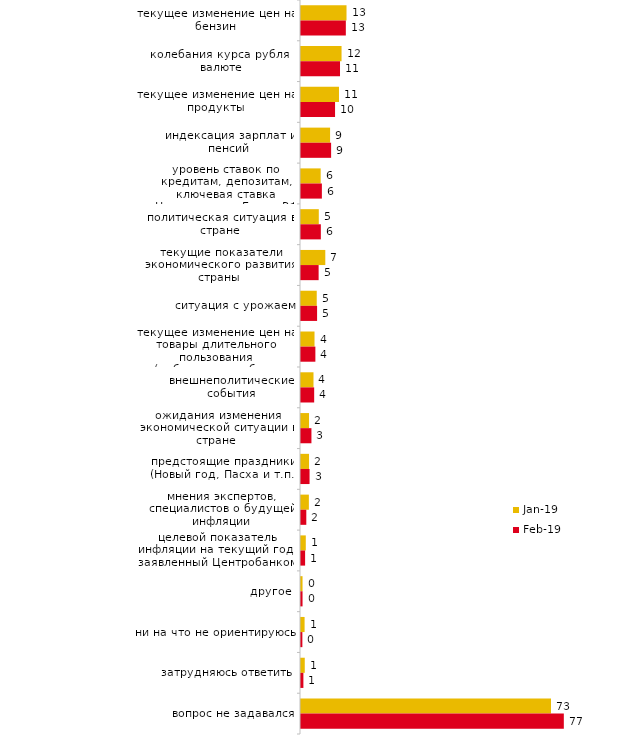
| Category | янв.19 | фев.19 |
|---|---|---|
| текущее изменение цен на бензин | 13.3 | 13.1 |
| колебания курса рубля к валюте | 11.85 | 11.4 |
| текущее изменение цен на продукты | 11.1 | 9.95 |
| индексация зарплат и пенсий | 8.5 | 8.8 |
| уровень ставок по кредитам, депозитам, ключевая ставка Центрального Банка РФ | 5.75 | 6.1 |
| политическая ситуация в стране | 5.2 | 5.8 |
| текущие показатели экономического развития страны | 7.1 | 5.15 |
| ситуация с урожаем | 4.6 | 4.7 |
| текущее изменение цен на товары длительного пользования (мебель, автомобиль, бытовая техника и т.п.) | 3.95 | 4.2 |
| внешнеполитические события | 3.65 | 3.85 |
| ожидания изменения экономической ситуации в стране | 2.35 | 3.05 |
| предстоящие праздники (Новый год, Пасха и т.п.) | 2.35 | 2.5 |
| мнения экспертов, специалистов о будущей инфляции | 2.3 | 1.55 |
| целевой показатель инфляции на текущий год, заявленный Центробанком | 1.4 | 1.2 |
| другое | 0.45 | 0.45 |
| ни на что не ориентируюсь | 1.05 | 0.4 |
| затрудняюсь ответить | 1.1 | 0.7 |
| вопрос не задавался | 73.05 | 76.8 |